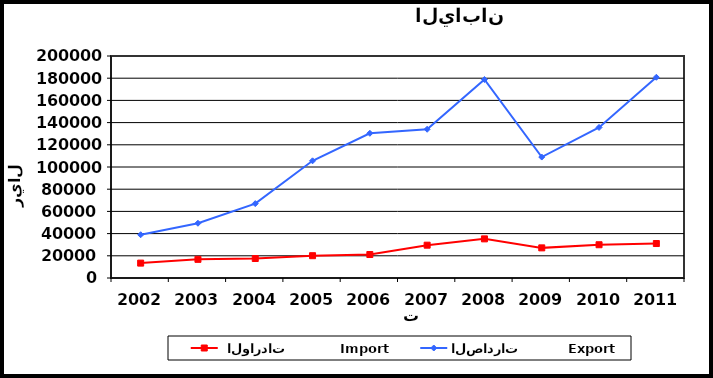
| Category |  الواردات           Import | الصادرات          Export |
|---|---|---|
| 2002.0 | 13405 | 38974 |
| 2003.0 | 16797 | 49325 |
| 2004.0 | 17555 | 67006 |
| 2005.0 | 20093 | 105580 |
| 2006.0 | 21146 | 130369 |
| 2007.0 | 29563 | 134007 |
| 2008.0 | 35251 | 178823 |
| 2009.0 | 27142 | 108956 |
| 2010.0 | 29957 | 135634 |
| 2011.0 | 31065 | 180828 |